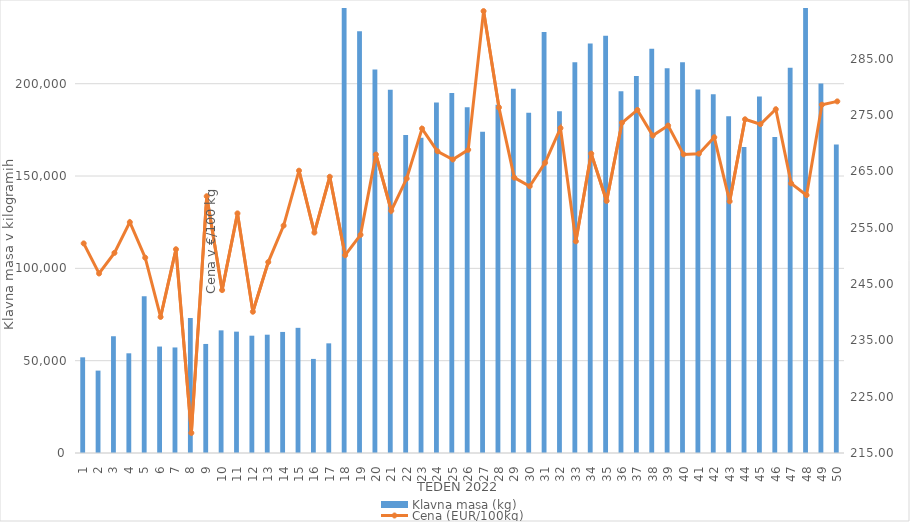
| Category | Klavna masa (kg) |
|---|---|
| 1.0 | 51818 |
| 2.0 | 44619 |
| 3.0 | 63233 |
| 4.0 | 53993 |
| 5.0 | 84871 |
| 6.0 | 57648 |
| 7.0 | 57159 |
| 8.0 | 73139 |
| 9.0 | 59056 |
| 10.0 | 66417 |
| 11.0 | 65723 |
| 12.0 | 63530 |
| 13.0 | 64069 |
| 14.0 | 65564 |
| 15.0 | 67787 |
| 16.0 | 50958 |
| 17.0 | 59387 |
| 18.0 | 241833 |
| 19.0 | 228389 |
| 20.0 | 207661 |
| 21.0 | 196732 |
| 22.0 | 172190 |
| 23.0 | 170751 |
| 24.0 | 189775 |
| 25.0 | 195029 |
| 26.0 | 187239 |
| 27.0 | 173967 |
| 28.0 | 188601 |
| 29.0 | 197293 |
| 30.0 | 184259 |
| 31.0 | 228023 |
| 32.0 | 185079 |
| 33.0 | 211612 |
| 34.0 | 221748 |
| 35.0 | 225927 |
| 36.0 | 195924 |
| 37.0 | 204224 |
| 38.0 | 218966 |
| 39.0 | 208403 |
| 40.0 | 211635 |
| 41.0 | 196841 |
| 42.0 | 194271 |
| 43.0 | 182399 |
| 44.0 | 165696 |
| 45.0 | 193022 |
| 46.0 | 171172 |
| 47.0 | 208597 |
| 48.0 | 253151 |
| 49.0 | 200117 |
| 50.0 | 167119 |